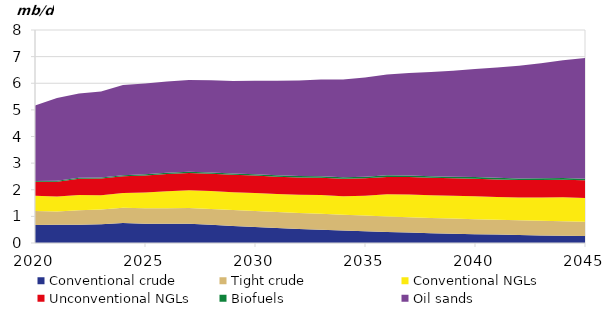
| Category | Conventional crude | Tight crude | Conventional NGLs | Unconventional NGLs | Biofuels | Oil sands |
|---|---|---|---|---|---|---|
| 2020-01-01 | 0.681 | 0.518 | 0.58 | 0.517 | 0.037 | 2.834 |
| 2021-01-01 | 0.682 | 0.503 | 0.565 | 0.553 | 0.037 | 3.103 |
| 2022-01-01 | 0.684 | 0.548 | 0.572 | 0.61 | 0.041 | 3.161 |
| 2023-01-01 | 0.702 | 0.558 | 0.537 | 0.621 | 0.042 | 3.232 |
| 2024-01-01 | 0.752 | 0.568 | 0.554 | 0.63 | 0.044 | 3.387 |
| 2025-01-01 | 0.727 | 0.574 | 0.596 | 0.637 | 0.045 | 3.411 |
| 2026-01-01 | 0.727 | 0.58 | 0.64 | 0.644 | 0.046 | 3.429 |
| 2027-01-01 | 0.726 | 0.586 | 0.67 | 0.65 | 0.047 | 3.447 |
| 2028-01-01 | 0.688 | 0.591 | 0.67 | 0.65 | 0.048 | 3.466 |
| 2029-01-01 | 0.643 | 0.597 | 0.67 | 0.65 | 0.049 | 3.474 |
| 2030-01-01 | 0.601 | 0.598 | 0.682 | 0.649 | 0.05 | 3.509 |
| 2031-01-01 | 0.563 | 0.599 | 0.68 | 0.65 | 0.051 | 3.547 |
| 2032-01-01 | 0.528 | 0.599 | 0.684 | 0.651 | 0.052 | 3.588 |
| 2033-01-01 | 0.496 | 0.6 | 0.703 | 0.652 | 0.053 | 3.632 |
| 2034-01-01 | 0.466 | 0.595 | 0.696 | 0.653 | 0.054 | 3.679 |
| 2035-01-01 | 0.439 | 0.589 | 0.747 | 0.654 | 0.056 | 3.731 |
| 2036-01-01 | 0.414 | 0.584 | 0.831 | 0.655 | 0.057 | 3.786 |
| 2037-01-01 | 0.391 | 0.578 | 0.854 | 0.656 | 0.058 | 3.846 |
| 2038-01-01 | 0.369 | 0.573 | 0.853 | 0.657 | 0.059 | 3.911 |
| 2039-01-01 | 0.35 | 0.568 | 0.853 | 0.658 | 0.06 | 3.981 |
| 2040-01-01 | 0.332 | 0.562 | 0.861 | 0.659 | 0.061 | 4.057 |
| 2041-01-01 | 0.315 | 0.557 | 0.857 | 0.66 | 0.061 | 4.138 |
| 2042-01-01 | 0.3 | 0.552 | 0.853 | 0.661 | 0.061 | 4.226 |
| 2043-01-01 | 0.286 | 0.546 | 0.873 | 0.662 | 0.061 | 4.322 |
| 2044-01-01 | 0.273 | 0.541 | 0.902 | 0.663 | 0.061 | 4.424 |
| 2045-01-01 | 0.261 | 0.536 | 0.891 | 0.664 | 0.061 | 4.535 |